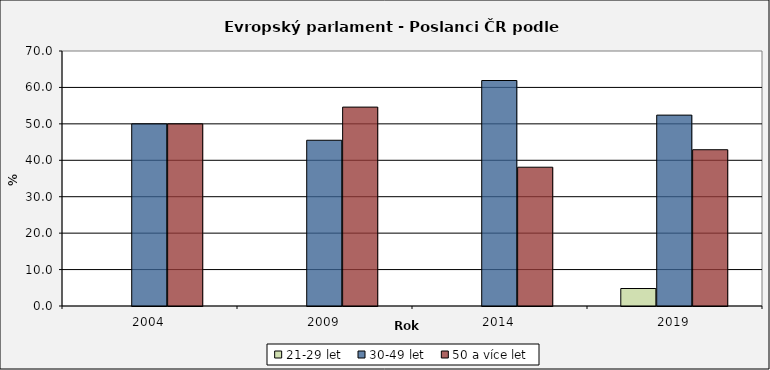
| Category | 21-29 let | 30-49 let | 50 a více let |
|---|---|---|---|
| 2004.0 | 0 | 50 | 50 |
| 2009.0 | 0 | 45.5 | 54.6 |
| 2014.0 | 0 | 61.9 | 38.1 |
| 2019.0 | 4.8 | 52.4 | 42.9 |